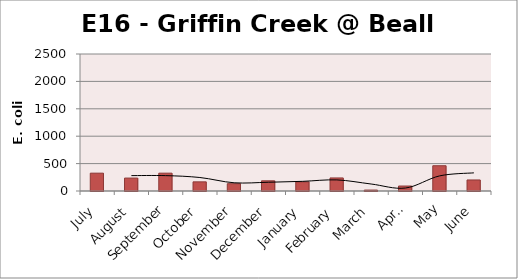
| Category | E. coli MPN |
|---|---|
| July | 325.5 |
| August | 235.9 |
| September | 325.5 |
| October | 166.9 |
| November | 133.3 |
| December | 186 |
| January | 166.9 |
| February | 238.2 |
| March | 17.1 |
| April | 90.7 |
| May | 461.1 |
| June | 201.4 |